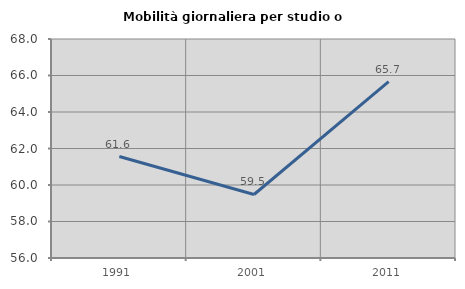
| Category | Mobilità giornaliera per studio o lavoro |
|---|---|
| 1991.0 | 61.559 |
| 2001.0 | 59.481 |
| 2011.0 | 65.668 |